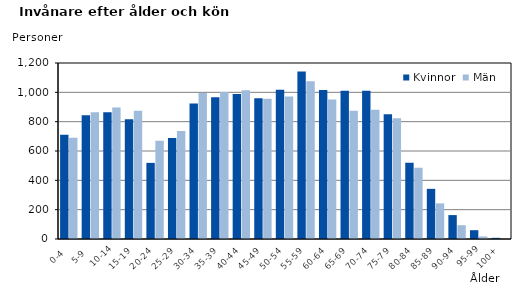
| Category | Kvinnor | Män |
|---|---|---|
|   0-4  | 710 | 691 |
|   5-9  | 844 | 865 |
| 10-14 | 864 | 897 |
| 15-19  | 817 | 874 |
| 20-24  | 519 | 670 |
| 25-29  | 688 | 737 |
| 30-34  | 924 | 995 |
| 35-39  | 966 | 1003 |
| 40-44  | 988 | 1014 |
| 45-49  | 960 | 957 |
| 50-54  | 1017 | 972 |
| 55-59  | 1142 | 1076 |
| 60-64  | 1016 | 951 |
| 65-69  | 1011 | 874 |
| 70-74  | 1010 | 882 |
| 75-79  | 850 | 823 |
| 80-84  | 520 | 486 |
| 85-89  | 342 | 243 |
| 90-94  | 163 | 94 |
| 95-99 | 60 | 17 |
| 100+ | 8 | 1 |